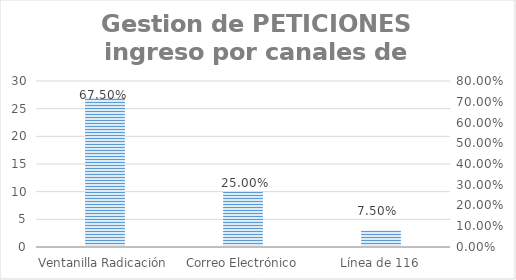
| Category | Series 0 |
|---|---|
| Ventanilla Radicación | 27 |
| Correo Electrónico | 10 |
| Línea de 116 | 3 |